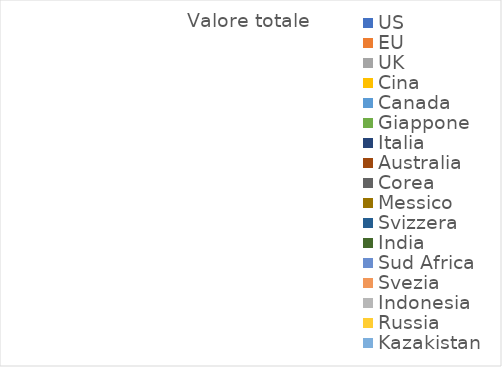
| Category | Valore totale |
|---|---|
| US | 0 |
| EU | 0 |
| UK | 0 |
| Cina | 0 |
| Canada | 0 |
| Giappone | 0 |
| Italia | 0 |
| Australia | 0 |
| Corea | 0 |
| Messico | 0 |
| Svizzera | 0 |
| India | 0 |
| Sud Africa | 0 |
| Svezia | 0 |
| Indonesia | 0 |
| Russia | 0 |
| Kazakistan | 0 |